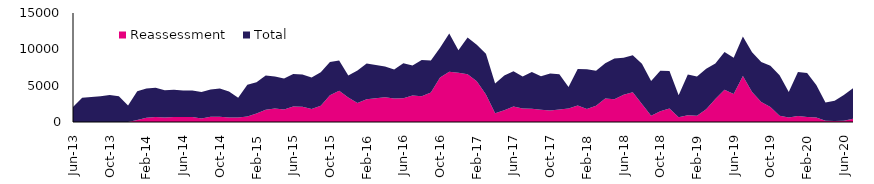
| Category | Reassessment | Total |
|---|---|---|
| 2013-06-01 | 0 | 2073 |
| 2013-07-01 | 6 | 3343 |
| 2013-08-01 | 6 | 3441 |
| 2013-09-01 | 13 | 3531 |
| 2013-10-01 | 12 | 3711 |
| 2013-11-01 | 11 | 3530 |
| 2013-12-01 | 6 | 2262 |
| 2014-01-01 | 288 | 3928 |
| 2014-02-01 | 578 | 4037 |
| 2014-03-01 | 700 | 4003 |
| 2014-04-01 | 612 | 3757 |
| 2014-05-01 | 691 | 3747 |
| 2014-06-01 | 689 | 3636 |
| 2014-07-01 | 686 | 3642 |
| 2014-08-01 | 470 | 3647 |
| 2014-09-01 | 714 | 3769 |
| 2014-10-01 | 725 | 3879 |
| 2014-11-01 | 636 | 3557 |
| 2014-12-01 | 629 | 2701 |
| 2015-01-01 | 761 | 4373 |
| 2015-02-01 | 1156 | 4328 |
| 2015-03-01 | 1698 | 4684 |
| 2015-04-01 | 1844 | 4406 |
| 2015-05-01 | 1731 | 4244 |
| 2015-06-01 | 2117 | 4485 |
| 2015-07-01 | 2084 | 4441 |
| 2015-08-01 | 1782 | 4335 |
| 2015-09-01 | 2235 | 4620 |
| 2015-10-01 | 3679 | 4593 |
| 2015-11-01 | 4295 | 4176 |
| 2015-12-01 | 3383 | 3030 |
| 2016-01-01 | 2629 | 4444 |
| 2016-02-01 | 3147 | 4897 |
| 2016-03-01 | 3280 | 4567 |
| 2016-04-01 | 3415 | 4234 |
| 2016-05-01 | 3250 | 3958 |
| 2016-06-01 | 3263 | 4826 |
| 2016-07-01 | 3632 | 4148 |
| 2016-08-01 | 3547 | 5000 |
| 2016-09-01 | 4062 | 4389 |
| 2016-10-01 | 6139 | 4066 |
| 2016-11-01 | 6921 | 5269 |
| 2016-12-01 | 6761 | 3107 |
| 2017-01-01 | 6572 | 5044 |
| 2017-02-01 | 5616 | 5012 |
| 2017-03-01 | 3776 | 5602 |
| 2017-04-01 | 1211 | 4084 |
| 2017-05-01 | 1614 | 4798 |
| 2017-06-01 | 2146 | 4838 |
| 2017-07-01 | 1872 | 4406 |
| 2017-08-01 | 1810 | 5058 |
| 2017-09-01 | 1672 | 4617 |
| 2017-10-01 | 1596 | 5067 |
| 2017-11-01 | 1709 | 4875 |
| 2017-12-01 | 1848 | 2960 |
| 2018-01-01 | 2270 | 5016 |
| 2018-02-01 | 1789 | 5461 |
| 2018-03-01 | 2252 | 4799 |
| 2018-04-01 | 3220 | 4878 |
| 2018-05-01 | 3128 | 5617 |
| 2018-06-01 | 3760 | 5071 |
| 2018-07-01 | 4080 | 5090 |
| 2018-08-01 | 2477 | 5523 |
| 2018-09-01 | 865 | 4791 |
| 2018-10-01 | 1466 | 5576 |
| 2018-11-01 | 1851 | 5176 |
| 2018-12-01 | 648 | 3031 |
| 2019-01-01 | 917 | 5614 |
| 2019-02-01 | 862 | 5398 |
| 2019-03-01 | 1764 | 5552 |
| 2019-04-01 | 3158 | 4904 |
| 2019-05-01 | 4425 | 5215 |
| 2019-06-01 | 3854 | 4984 |
| 2019-07-01 | 6326 | 5424 |
| 2019-08-01 | 4129 | 5478 |
| 2019-09-01 | 2769 | 5472 |
| 2019-10-01 | 2075 | 5652 |
| 2019-11-01 | 876 | 5569 |
| 2019-12-01 | 614 | 3528 |
| 2020-01-01 | 836 | 6037 |
| 2020-02-01 | 700 | 6035 |
| 2020-03-01 | 607 | 4468 |
| 2020-04-01 | 171 | 2525 |
| 2020-05-01 | 145 | 2781 |
| 2020-06-01 | 159 | 3561 |
| 2020-07-01 | 432 | 4221 |